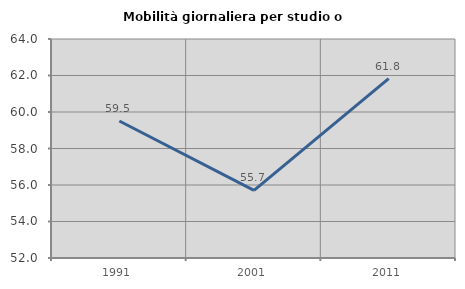
| Category | Mobilità giornaliera per studio o lavoro |
|---|---|
| 1991.0 | 59.505 |
| 2001.0 | 55.705 |
| 2011.0 | 61.83 |